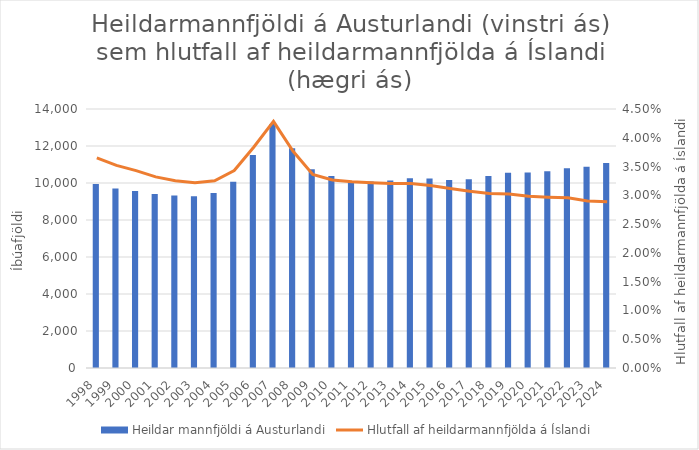
| Category | Heildar mannfjöldi á Austurlandi |
|---|---|
| 1998.0 | 9946 |
| 1999.0 | 9707 |
| 2000.0 | 9568 |
| 2001.0 | 9408 |
| 2002.0 | 9325 |
| 2003.0 | 9280 |
| 2004.0 | 9453 |
| 2005.0 | 10073 |
| 2006.0 | 11516 |
| 2007.0 | 13185 |
| 2008.0 | 11877 |
| 2009.0 | 10737 |
| 2010.0 | 10373 |
| 2011.0 | 10086 |
| 2012.0 | 10085 |
| 2013.0 | 10129 |
| 2014.0 | 10253 |
| 2015.0 | 10247 |
| 2016.0 | 10163 |
| 2017.0 | 10208 |
| 2018.0 | 10380 |
| 2019.0 | 10560 |
| 2020.0 | 10572 |
| 2021.0 | 10637 |
| 2022.0 | 10791 |
| 2023.0 | 10881 |
| 2024.0 | 11085 |